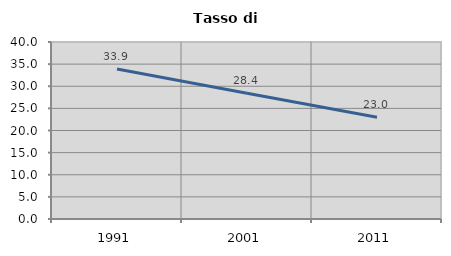
| Category | Tasso di disoccupazione   |
|---|---|
| 1991.0 | 33.92 |
| 2001.0 | 28.421 |
| 2011.0 | 23.007 |